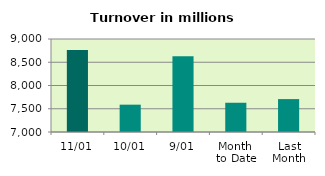
| Category | Series 0 |
|---|---|
| 11/01 | 8761.311 |
| 10/01 | 7587.824 |
| 9/01 | 8630.975 |
| Month 
to Date | 7629.082 |
| Last
Month | 7707.734 |